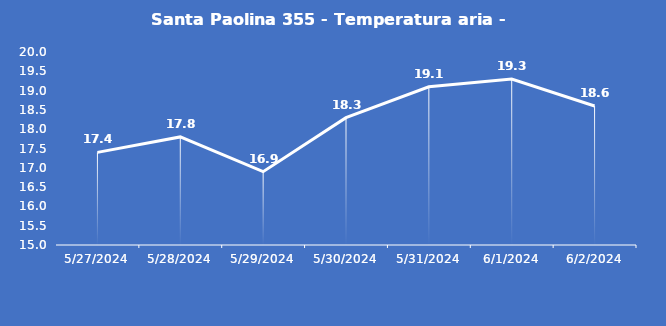
| Category | Santa Paolina 355 - Temperatura aria - Grezzo (°C) |
|---|---|
| 5/27/24 | 17.4 |
| 5/28/24 | 17.8 |
| 5/29/24 | 16.9 |
| 5/30/24 | 18.3 |
| 5/31/24 | 19.1 |
| 6/1/24 | 19.3 |
| 6/2/24 | 18.6 |